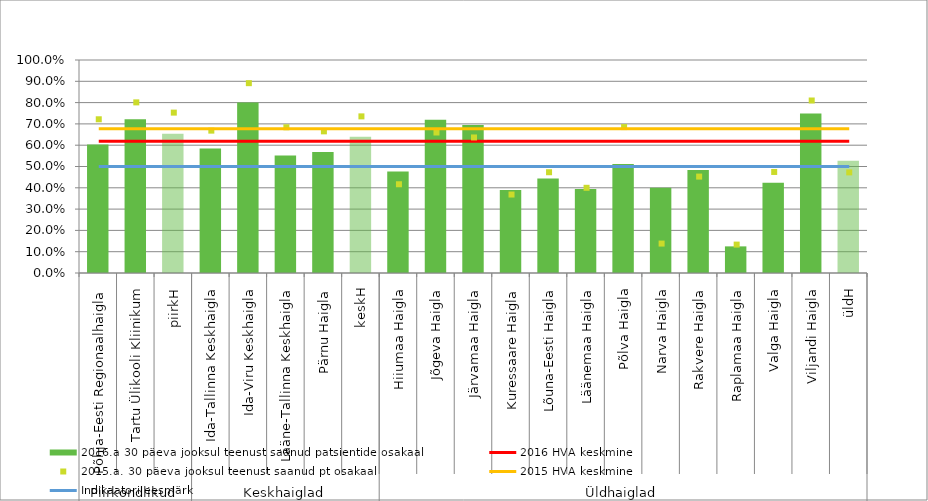
| Category | 2016.a 30 päeva jooksul teenust saanud patsientide osakaal |
|---|---|
| 0 | 0.604 |
| 1 | 0.722 |
| 2 | 0.653 |
| 3 | 0.584 |
| 4 | 0.8 |
| 5 | 0.552 |
| 6 | 0.568 |
| 7 | 0.64 |
| 8 | 0.476 |
| 9 | 0.72 |
| 10 | 0.694 |
| 11 | 0.39 |
| 12 | 0.443 |
| 13 | 0.395 |
| 14 | 0.512 |
| 15 | 0.4 |
| 16 | 0.484 |
| 17 | 0.125 |
| 18 | 0.424 |
| 19 | 0.748 |
| 20 | 0.527 |